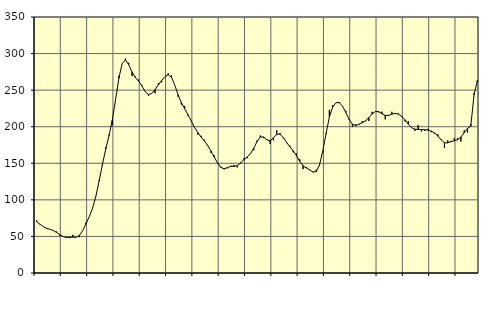
| Category | Piggar | Series 1 |
|---|---|---|
| nan | 72.2 | 70.2 |
| 87.0 | 66.4 | 66.82 |
| 87.0 | 63.4 | 63.47 |
| 87.0 | 60.5 | 61.09 |
| nan | 59.6 | 59.76 |
| 88.0 | 58 | 58.25 |
| 88.0 | 56.7 | 55.61 |
| 88.0 | 50.9 | 52.63 |
| nan | 49.6 | 49.89 |
| 89.0 | 49.3 | 48.65 |
| 89.0 | 47.6 | 48.89 |
| 89.0 | 52.2 | 49.01 |
| nan | 48.7 | 48.93 |
| 90.0 | 48.9 | 51.24 |
| 90.0 | 58 | 58.06 |
| 90.0 | 69.2 | 67.35 |
| nan | 76.8 | 76.92 |
| 91.0 | 87.7 | 88.49 |
| 91.0 | 105.3 | 104.83 |
| 91.0 | 127.1 | 125.73 |
| nan | 146.8 | 148.47 |
| 92.0 | 172 | 169.24 |
| 92.0 | 188.9 | 187.7 |
| 92.0 | 201.9 | 209.04 |
| nan | 236.8 | 237.04 |
| 93.0 | 269.5 | 266.18 |
| 93.0 | 286.3 | 286.27 |
| 93.0 | 293.3 | 291.33 |
| nan | 287.4 | 284.81 |
| 94.0 | 269.3 | 274.79 |
| 94.0 | 268.5 | 267.31 |
| 94.0 | 264.5 | 262.32 |
| nan | 257.2 | 255.71 |
| 95.0 | 247.8 | 248.13 |
| 95.0 | 242.1 | 243.94 |
| 95.0 | 245.7 | 245.47 |
| nan | 245.7 | 250.8 |
| 96.0 | 259.3 | 257.05 |
| 96.0 | 260.8 | 263.1 |
| 96.0 | 268.3 | 268.41 |
| nan | 273 | 271.07 |
| 97.0 | 270.1 | 267.63 |
| 97.0 | 256.9 | 256.92 |
| 97.0 | 241 | 243.66 |
| nan | 230.5 | 232.93 |
| 98.0 | 228.5 | 224.65 |
| 98.0 | 214.8 | 216.46 |
| 98.0 | 207.3 | 207.94 |
| nan | 199.4 | 199.22 |
| 99.0 | 189.2 | 191.87 |
| 99.0 | 187.6 | 185.97 |
| 99.0 | 182.2 | 180.61 |
| nan | 174 | 174.45 |
| 0.0 | 164.4 | 166.86 |
| 0.0 | 160.6 | 158.61 |
| 0.0 | 149.8 | 150.46 |
| nan | 145.3 | 144.3 |
| 1.0 | 141.7 | 142.51 |
| 1.0 | 143.1 | 144.13 |
| 1.0 | 146.6 | 145.79 |
| nan | 147.7 | 145.86 |
| 2.0 | 144.4 | 146.72 |
| 2.0 | 151 | 150.16 |
| 2.0 | 156.8 | 154.74 |
| nan | 157 | 158.65 |
| 3.0 | 163.5 | 162.96 |
| 3.0 | 167.7 | 170.47 |
| 3.0 | 181.1 | 179.65 |
| nan | 187.9 | 185.88 |
| 4.0 | 184.4 | 186 |
| 4.0 | 182.7 | 182.1 |
| 4.0 | 176.6 | 180.67 |
| nan | 181.3 | 184.71 |
| 5.0 | 195.4 | 189.71 |
| 5.0 | 191.3 | 189.88 |
| 5.0 | 184.1 | 185.09 |
| nan | 177.6 | 178.53 |
| 6.0 | 174 | 172.55 |
| 6.0 | 165 | 167.14 |
| 6.0 | 163.6 | 160.45 |
| nan | 155.4 | 152.64 |
| 7.0 | 142 | 146.74 |
| 7.0 | 145 | 143.57 |
| 7.0 | 141.4 | 141.03 |
| nan | 137.8 | 138.16 |
| 8.0 | 141.2 | 138.61 |
| 8.0 | 146.5 | 147.64 |
| 8.0 | 164.2 | 166.57 |
| nan | 191.5 | 190.65 |
| 9.0 | 223.1 | 213.2 |
| 9.0 | 229.6 | 226.84 |
| 9.0 | 232.9 | 232.85 |
| nan | 233.9 | 232.91 |
| 10.0 | 227.5 | 228.07 |
| 10.0 | 221.8 | 219.6 |
| 10.0 | 209.4 | 210.19 |
| nan | 199.7 | 203.49 |
| 11.0 | 203.2 | 201.55 |
| 11.0 | 202.4 | 203.4 |
| 11.0 | 207.6 | 205.46 |
| nan | 208.8 | 207.88 |
| 12.0 | 207.8 | 212.4 |
| 12.0 | 220.3 | 217.37 |
| 12.0 | 220.7 | 220.78 |
| nan | 219.6 | 220.61 |
| 13.0 | 220.6 | 217.74 |
| 13.0 | 210 | 215.42 |
| 13.0 | 216.1 | 215.36 |
| nan | 220.4 | 217.17 |
| 14.0 | 217.5 | 218.3 |
| 14.0 | 217.9 | 217.08 |
| 14.0 | 213.4 | 214.19 |
| nan | 207.2 | 209.42 |
| 15.0 | 207.4 | 203.45 |
| 15.0 | 198.4 | 198.64 |
| 15.0 | 194.3 | 196.63 |
| nan | 202.1 | 196.42 |
| 16.0 | 193.4 | 196.15 |
| 16.0 | 194.4 | 195.85 |
| 16.0 | 197.2 | 195.45 |
| nan | 192.4 | 194.01 |
| 17.0 | 190.1 | 191.38 |
| 17.0 | 189.5 | 187.2 |
| 17.0 | 182.5 | 181.9 |
| nan | 171.2 | 178.06 |
| 18.0 | 181.4 | 177.9 |
| 18.0 | 178.9 | 179.86 |
| 18.0 | 184.6 | 180.83 |
| nan | 184.6 | 182.23 |
| 19.0 | 179.8 | 185.94 |
| 19.0 | 194.9 | 191.61 |
| 19.0 | 191.7 | 197.71 |
| nan | 203.4 | 200.73 |
| 20.0 | 245.9 | 243.79 |
| 20.0 | 261.3 | 263.28 |